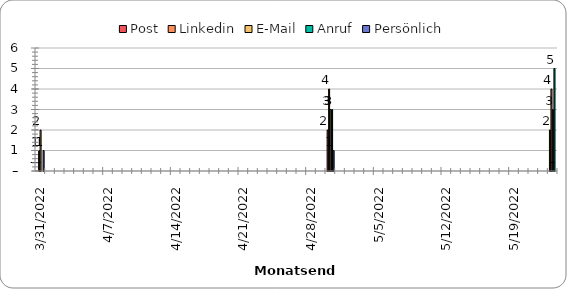
| Category | Post | Linkedin | E-Mail | Anruf | Persönlich |
|---|---|---|---|---|---|
| 5/23/22 | 2 | 4 | 3 | 5 | 0 |
| 4/30/22 | 2 | 4 | 3 | 3 | 1 |
| 3/31/22 | 0 | 1 | 2 | 0 | 1 |